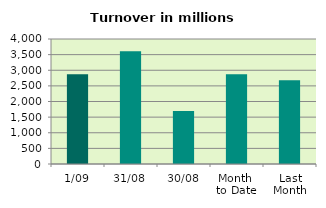
| Category | Series 0 |
|---|---|
| 1/09 | 2873.709 |
| 31/08 | 3604.563 |
| 30/08 | 1695.63 |
| Month 
to Date | 2873.709 |
| Last
Month | 2681.097 |